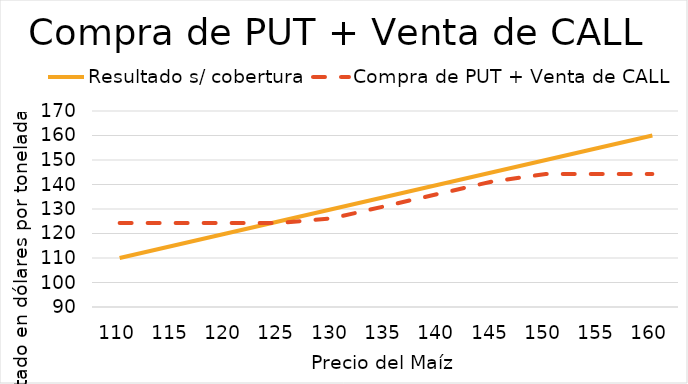
| Category | Resultado s/ cobertura | Compra de PUT + Venta de CALL |
|---|---|---|
| 110.0 | 110 | 124.25 |
| 115.0 | 115 | 124.25 |
| 120.0 | 120 | 124.25 |
| 125.0 | 125 | 124.25 |
| 130.0 | 130 | 126.25 |
| 135.0 | 135 | 131.25 |
| 140.0 | 140 | 136.25 |
| 145.0 | 145 | 141.25 |
| 150.0 | 150 | 144.25 |
| 155.0 | 155 | 144.25 |
| 160.0 | 160 | 144.25 |